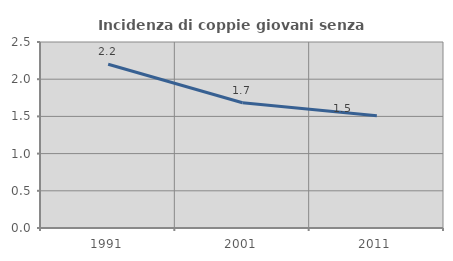
| Category | Incidenza di coppie giovani senza figli |
|---|---|
| 1991.0 | 2.201 |
| 2001.0 | 1.684 |
| 2011.0 | 1.509 |